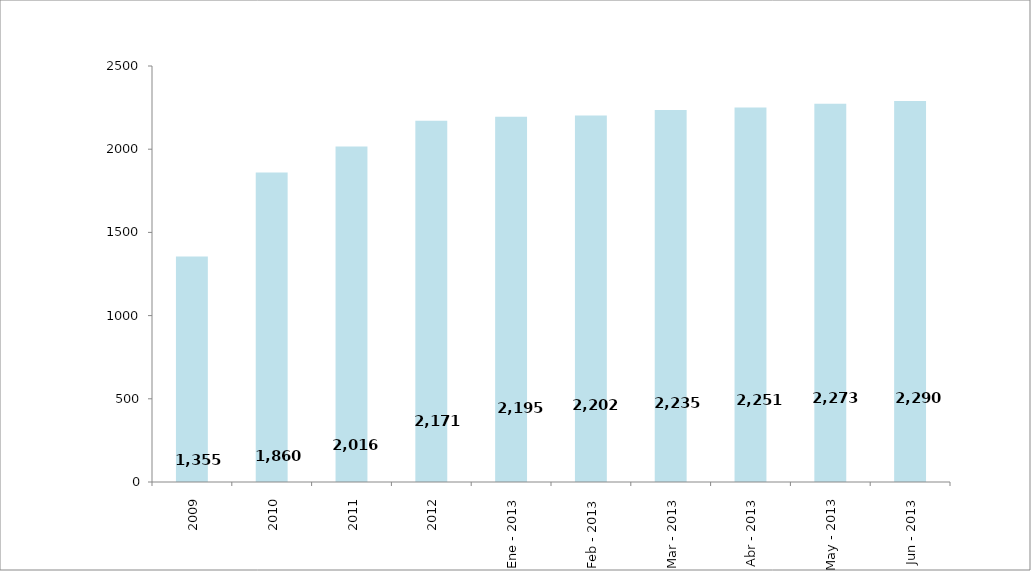
| Category | Series 0 |
|---|---|
| 2009 | 1355 |
| 2010 | 1860 |
| 2011 | 2016 |
| 2012 | 2171 |
| Ene - 2013 | 2195 |
| Feb - 2013 | 2202 |
| Mar - 2013 | 2235 |
| Abr - 2013 | 2251 |
| May - 2013 | 2273 |
| Jun - 2013 | 2290 |